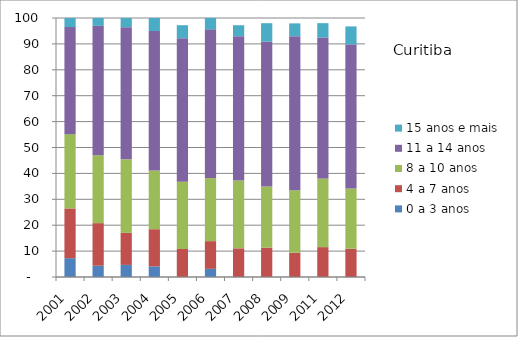
| Category | 0 a 3 anos | 4 a 7 anos | 8 a 10 anos | 11 a 14 anos | 15 anos e mais |
|---|---|---|---|---|---|
| 2001.0 | 7.26 | 19.21 | 28.68 | 41.36 | 3.49 |
| 2002.0 | 4.36 | 16.44 | 26.22 | 49.95 | 3.02 |
| 2003.0 | 4.67 | 12.37 | 28.4 | 51.01 | 3.55 |
| 2004.0 | 4.11 | 14.35 | 22.67 | 53.86 | 5.01 |
| 2005.0 | 0 | 10.83 | 25.98 | 55.36 | 5.05 |
| 2006.0 | 3.15 | 10.7 | 24.36 | 57.4 | 4.39 |
| 2007.0 | 0 | 11.07 | 26.16 | 55.74 | 4.24 |
| 2008.0 | 0 | 11.35 | 23.6 | 55.96 | 7.08 |
| 2009.0 | 0 | 9.38 | 24.12 | 59.48 | 4.95 |
| 2011.0 | 0 | 11.54 | 26.53 | 54.37 | 5.57 |
| 2012.0 | 0 | 10.93 | 23.26 | 55.58 | 6.98 |